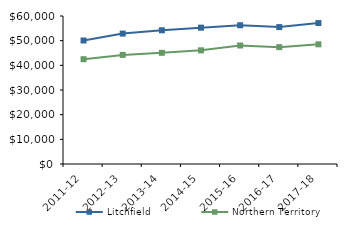
| Category | Litchfield | Northern Territory |
|---|---|---|
| 2011-12 | 50078.5 | 42481 |
| 2012-13 | 52872.55 | 44232.02 |
| 2013-14 | 54216.05 | 45075.51 |
| 2014-15 | 55268.83 | 46083.65 |
| 2015-16 | 56242 | 48046.27 |
| 2016-17 | 55505.27 | 47367.05 |
| 2017-18 | 57142.11 | 48519 |